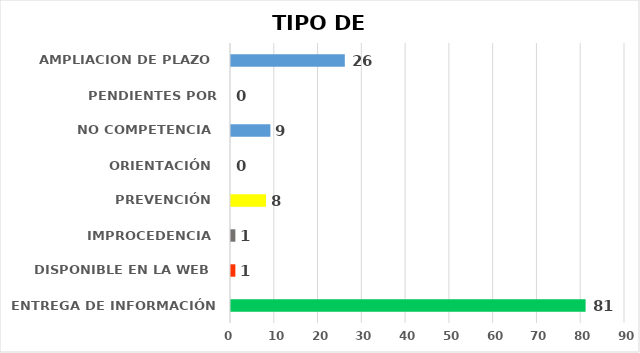
| Category | CANTIDAD DE RESPUESTAS |
|---|---|
| ENTREGA DE INFORMACIÓN | 81 |
| DISPONIBLE EN LA WEB | 1 |
| IMPROCEDENCIA | 1 |
| PREVENCIÓN | 8 |
| ORIENTACIÓN | 0 |
| NO COMPETENCIA | 9 |
| PENDIENTES POR CONTESTAR | 0 |
| AMPLIACION DE PLAZO | 26 |